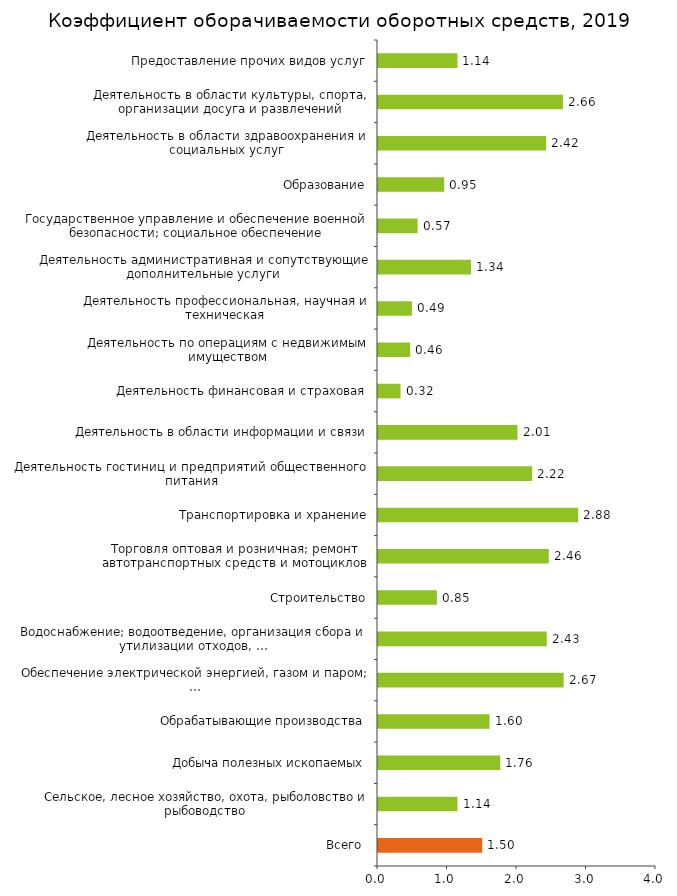
| Category | Series 0 |
|---|---|
| Всего  | 1.499 |
| Сельское, лесное хозяйство, охота, рыболовство и рыбоводство | 1.144 |
| Добыча полезных ископаемых | 1.76 |
| Обрабатывающие производства | 1.605 |
| Обеспечение электрической энергией, газом и паром; … | 2.671 |
| Водоснабжение; водоотведение, организация сбора и утилизации отходов, … | 2.428 |
| Строительство | 0.847 |
| Торговля оптовая и розничная; ремонт автотранспортных средств и мотоциклов | 2.457 |
| Транспортировка и хранение | 2.88 |
| Деятельность гостиниц и предприятий общественного питания | 2.218 |
| Деятельность в области информации и связи | 2.008 |
| Деятельность финансовая и страховая | 0.324 |
| Деятельность по операциям с недвижимым имуществом | 0.463 |
| Деятельность профессиональная, научная и техническая | 0.488 |
| Деятельность административная и сопутствующие дополнительные услуги | 1.338 |
| Государственное управление и обеспечение военной безопасности; социальное обеспечение | 0.57 |
| Образование | 0.953 |
| Деятельность в области здравоохранения и социальных услуг | 2.42 |
| Деятельность в области культуры, спорта, организации досуга и развлечений | 2.663 |
| Предоставление прочих видов услуг | 1.144 |